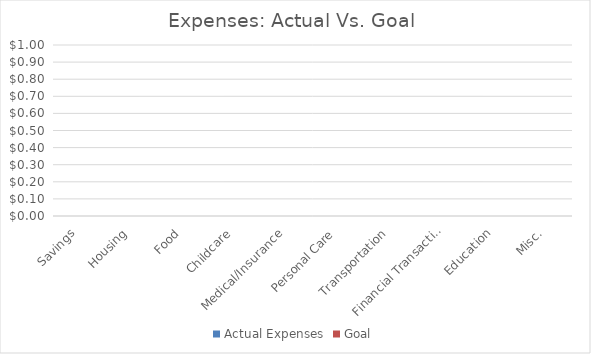
| Category | Actual Expenses | Goal |
|---|---|---|
| Savings | 0 | 0 |
| Housing | 0 | 0 |
| Food | 0 | 0 |
| Childcare | 0 | 0 |
| Medical/Insurance | 0 | 0 |
| Personal Care | 0 | 0 |
| Transportation | 0 | 0 |
| Financial Transactions | 0 | 0 |
| Education | 0 | 0 |
| Misc. | 0 | 0 |